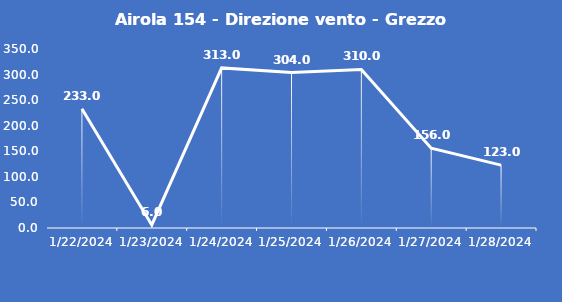
| Category | Airola 154 - Direzione vento - Grezzo (°N) |
|---|---|
| 1/22/24 | 233 |
| 1/23/24 | 6 |
| 1/24/24 | 313 |
| 1/25/24 | 304 |
| 1/26/24 | 310 |
| 1/27/24 | 156 |
| 1/28/24 | 123 |